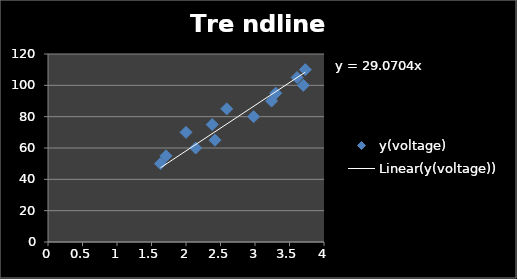
| Category | y(voltage) |
|---|---|
| 1.63 | 50 |
| 1.71 | 55 |
| 2.14 | 60 |
| 2.42 | 65 |
| 2.0 | 70 |
| 2.38 | 75 |
| 2.98 | 80 |
| 2.59 | 85 |
| 3.24 | 90 |
| 3.3 | 95 |
| 3.7 | 100 |
| 3.61 | 105 |
| 3.73 | 110 |